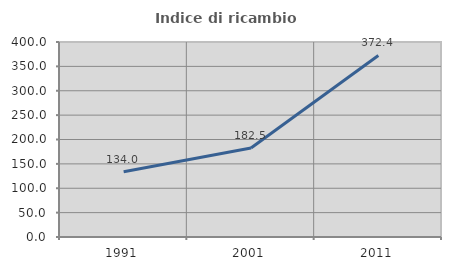
| Category | Indice di ricambio occupazionale  |
|---|---|
| 1991.0 | 133.981 |
| 2001.0 | 182.499 |
| 2011.0 | 372.449 |